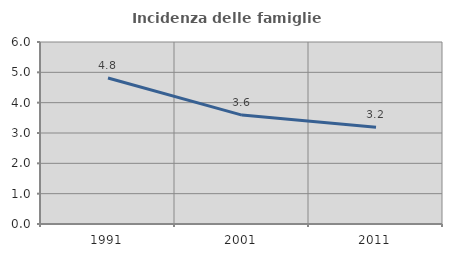
| Category | Incidenza delle famiglie numerose |
|---|---|
| 1991.0 | 4.813 |
| 2001.0 | 3.591 |
| 2011.0 | 3.191 |